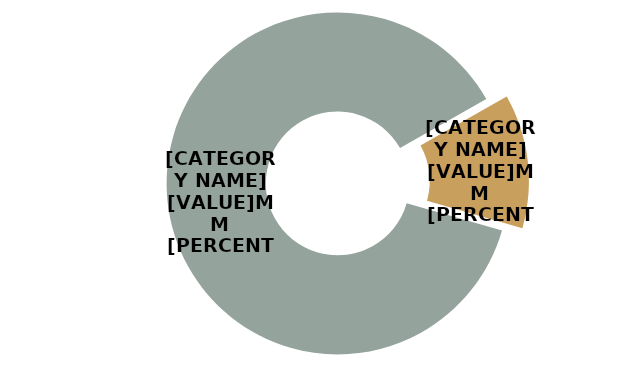
| Category | Series 0 |
|---|---|
| CONVENTIONAL | 95.095 |
| ORGANIC | 13.793 |